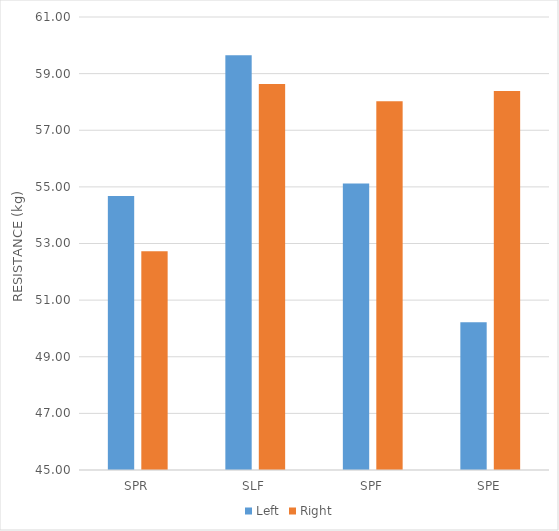
| Category | Left | Right |
|---|---|---|
| SPR | 54.68 | 52.73 |
| SLF | 59.65 | 58.63 |
| SPF | 55.12 | 58.02 |
| SPE | 50.22 | 58.39 |